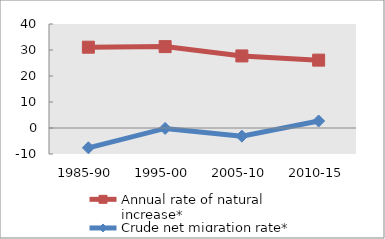
| Category | Annual rate of natural increase* | Crude net migration rate* |
|---|---|---|
| 1985-90 | 31.079 | -7.617 |
| 1995-00 | 31.3 | -0.162 |
| 2005-10 | 27.719 | -3.136 |
| 2010-15 | 26.102 | 2.697 |